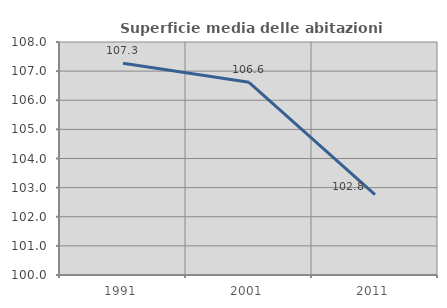
| Category | Superficie media delle abitazioni occupate |
|---|---|
| 1991.0 | 107.273 |
| 2001.0 | 106.617 |
| 2011.0 | 102.761 |